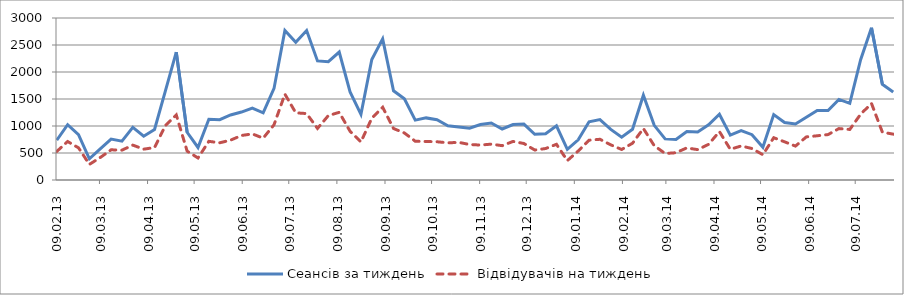
| Category | Сеансів за тиждень | Відвідувачів на тиждень |
|---|---|---|
| 2013-02-09 | 738 | 529 |
| 2013-02-16 | 1023 | 713 |
| 2013-02-23 | 841 | 596 |
| 2013-03-02 | 392 | 289 |
| 2013-03-09 | 575 | 416 |
| 2013-03-16 | 757 | 559 |
| 2013-03-23 | 720 | 553 |
| 2013-03-30 | 974 | 646 |
| 2013-04-06 | 811 | 571 |
| 2013-04-13 | 936 | 601 |
| 2013-04-20 | 1651 | 1009 |
| 2013-04-27 | 2368 | 1205 |
| 2013-05-04 | 884 | 534 |
| 2013-05-11 | 602 | 408 |
| 2013-05-18 | 1126 | 716 |
| 2013-05-25 | 1118 | 689 |
| 2013-06-01 | 1205 | 738 |
| 2013-06-08 | 1258 | 824 |
| 2013-06-15 | 1333 | 854 |
| 2013-06-22 | 1244 | 775 |
| 2013-06-29 | 1696 | 1023 |
| 2013-07-06 | 2769 | 1590 |
| 2013-07-13 | 2550 | 1244 |
| 2013-07-20 | 2768 | 1230 |
| 2013-07-27 | 2205 | 955 |
| 2013-08-03 | 2191 | 1193 |
| 2013-08-10 | 2369 | 1253 |
| 2013-08-17 | 1631 | 902 |
| 2013-08-24 | 1217 | 705 |
| 2013-08-31 | 2232 | 1145 |
| 2013-09-07 | 2614 | 1347 |
| 2013-09-14 | 1652 | 953 |
| 2013-09-21 | 1503 | 871 |
| 2013-09-28 | 1108 | 718 |
| 2013-10-05 | 1150 | 713 |
| 2013-10-12 | 1115 | 708 |
| 2013-10-19 | 1005 | 688 |
| 2013-10-26 | 981 | 697 |
| 2013-11-02 | 959 | 657 |
| 2013-11-09 | 1027 | 647 |
| 2013-11-16 | 1056 | 664 |
| 2013-11-23 | 945 | 636 |
| 2013-11-30 | 1026 | 714 |
| 2013-12-07 | 1036 | 676 |
| 2013-12-14 | 846 | 555 |
| 2013-12-21 | 855 | 583 |
| 2013-12-28 | 1002 | 661 |
| 2014-01-04 | 568 | 359 |
| 2014-01-11 | 745 | 537 |
| 2014-01-18 | 1078 | 737 |
| 2014-01-25 | 1119 | 754 |
| 2014-02-01 | 937 | 651 |
| 2014-02-08 | 792 | 565 |
| 2014-02-15 | 939 | 681 |
| 2014-02-22 | 1570 | 954 |
| 2014-03-01 | 1012 | 635 |
| 2014-03-08 | 761 | 491 |
| 2014-03-15 | 750 | 505 |
| 2014-03-22 | 899 | 595 |
| 2014-03-29 | 890 | 562 |
| 2014-04-05 | 1021 | 660 |
| 2014-04-12 | 1217 | 897 |
| 2014-04-19 | 832 | 569 |
| 2014-04-26 | 916 | 630 |
| 2014-05-03 | 839 | 583 |
| 2014-05-10 | 605 | 468 |
| 2014-05-17 | 1212 | 783 |
| 2014-05-24 | 1065 | 707 |
| 2014-05-31 | 1037 | 628 |
| 2014-06-07 | 1162 | 798 |
| 2014-06-14 | 1287 | 819 |
| 2014-06-21 | 1286 | 841 |
| 2014-06-28 | 1492 | 952 |
| 2014-07-05 | 1419 | 936 |
| 2014-07-12 | 2228 | 1219 |
| 2014-07-19 | 2821 | 1417 |
| 2014-07-26 | 1773 | 886 |
| 2014-08-02 | 1628 | 849 |